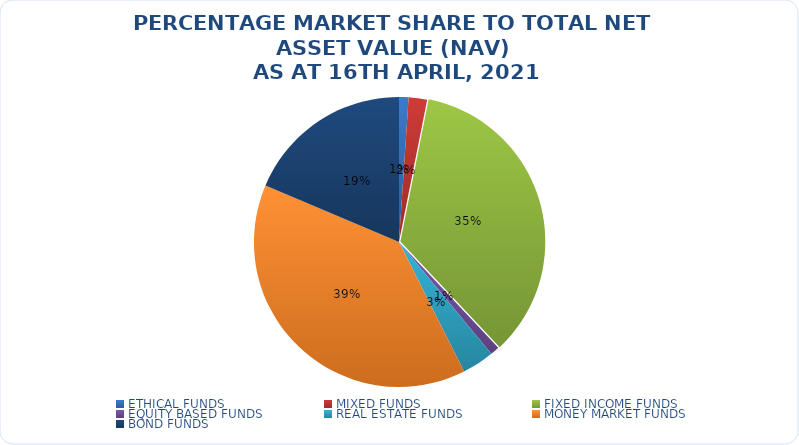
| Category | NET ASSET VALUE |
|---|---|
| ETHICAL FUNDS | 14875899238.33 |
| MIXED FUNDS | 28776493345.83 |
| FIXED INCOME FUNDS | 488805150444.311 |
| EQUITY BASED FUNDS | 14345654667.16 |
| REAL ESTATE FUNDS | 50020910716.831 |
| MONEY MARKET FUNDS | 543483754460.617 |
| BOND FUNDS | 261045508850.17 |